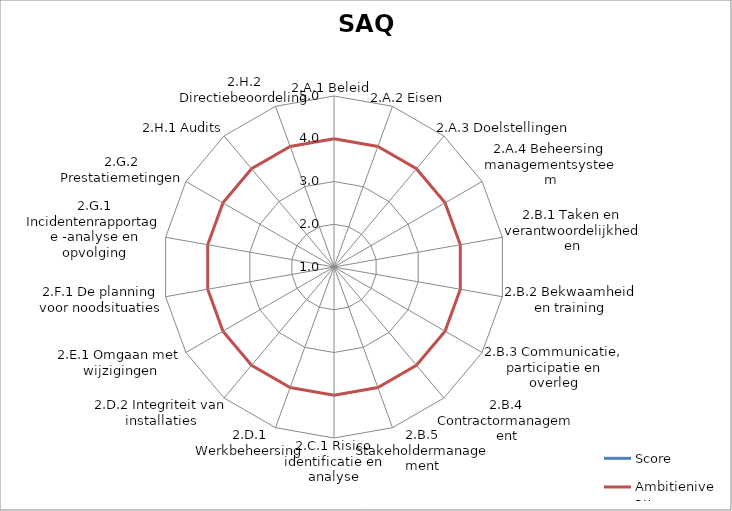
| Category | Score | Ambitieniveau |
|---|---|---|
| 2.A.1 Beleid | 1 | 4 |
| 2.A.2 Eisen | 1 | 4 |
| 2.A.3 Doelstellingen | 1 | 4 |
| 2.A.4 Beheersing managementsysteem | 1 | 4 |
| 2.B.1 Taken en verantwoordelijkheden | 1 | 4 |
| 2.B.2 Bekwaamheid en training | 1 | 4 |
| 2.B.3 Communicatie, participatie en overleg | 1 | 4 |
| 2.B.4 Contractormanagement | 1 | 4 |
| 2.B.5 Stakeholdermanagement | 1 | 4 |
| 2.C.1 Risico identificatie en analyse | 1 | 4 |
| 2.D.1 Werkbeheersing | 1 | 4 |
| 2.D.2 Integriteit van installaties | 1 | 4 |
| 2.E.1 Omgaan met wijzigingen | 1 | 4 |
| 2.F.1 De planning voor noodsituaties | 1 | 4 |
| 2.G.1 Incidentenrapportage -analyse en opvolging | 1 | 4 |
| 2.G.2 Prestatiemetingen | 1 | 4 |
| 2.H.1 Audits | 1 | 4 |
| 2.H.2 Directiebeoordeling | 1 | 4 |